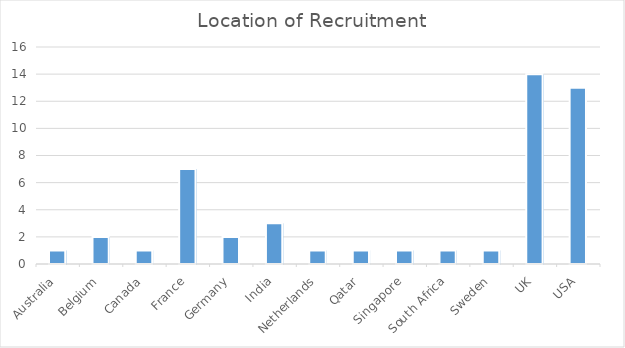
| Category | Qty |
|---|---|
| Australia | 1 |
| Belgium | 2 |
| Canada | 1 |
| France | 7 |
| Germany | 2 |
| India | 3 |
| Netherlands | 1 |
| Qatar | 1 |
| Singapore | 1 |
| South Africa | 1 |
| Sweden | 1 |
| UK | 14 |
| USA | 13 |